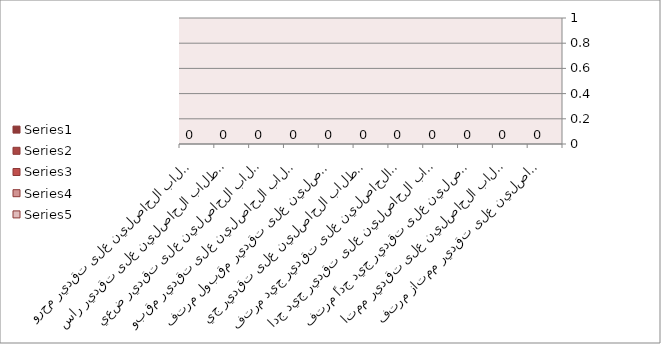
| Category | Series 0 | Series 1 | Series 2 | Series 3 | Series 4 |
|---|---|---|---|---|---|
| عدد الطلاب الحاصلين على تقدير ممتاز مرتفع |  |  |  | 0 |  |
| عدد الطلاب الحاصلين على تقدير ممتاز  |  |  |  | 0 |  |
| عدد الطلاب الحاصلين على تقدير جيد جداً مرتفع |  |  |  | 0 |  |
| عدد الطلاب الحاصلين على تقدير جيد جداً |  |  |  | 0 |  |
| عدد الطلاب الحاصلين على تقدير جيد مرتفع |  |  |  | 0 |  |
| عدد الطلاب الحاصلين على تقدير جيد  |  |  |  | 0 |  |
| عدد الطلاب الحاصلين على تقدير مقبول مرتفع |  |  |  | 0 |  |
| عدد الطلاب الحاصلين على تقدير مقبول  |  |  |  | 0 |  |
| عدد الطلاب الحاصلين على تقدير ضعيف |  |  |  | 0 |  |
| عدد الطلاب الحاصلين على تقدير راسب |  |  |  | 0 |  |
| عدد الطلاب الحاصلين على تقدير محروم |  |  |  | 0 |  |